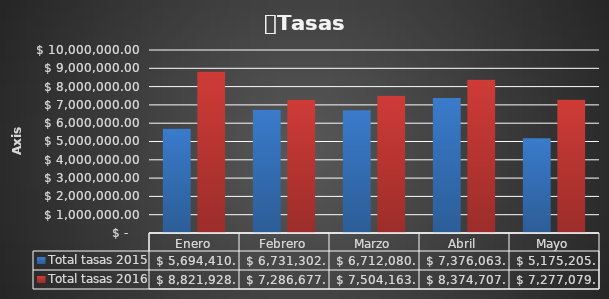
| Category | Total tasas 2015 | Total tasas 2016 |
|---|---|---|
| Enero | 5694410.61 | 8821928.41 |
| Febrero | 6731302.3 | 7286677.42 |
| Marzo | 6712080.59 | 7504163.29 |
| Abril | 7376063.79 | 8374707.61 |
| Mayo | 5175205.32 | 7277079.86 |